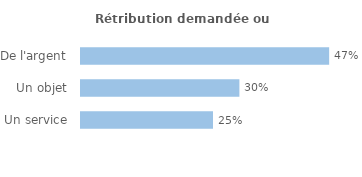
| Category | Series 0 |
|---|---|
| Un service | 0.25 |
| Un objet | 0.3 |
| De l'argent | 0.47 |